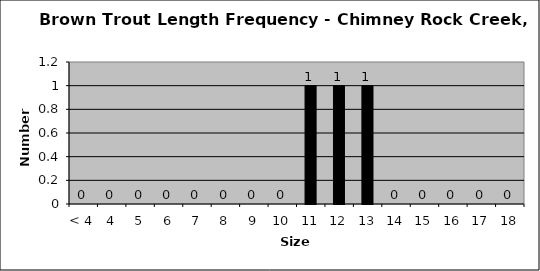
| Category | Series 0 |
|---|---|
| < 4 | 0 |
| 4 | 0 |
| 5 | 0 |
| 6 | 0 |
| 7 | 0 |
| 8 | 0 |
| 9 | 0 |
| 10 | 0 |
| 11 | 1 |
| 12 | 1 |
| 13 | 1 |
| 14 | 0 |
| 15 | 0 |
| 16 | 0 |
| 17 | 0 |
| 18 | 0 |